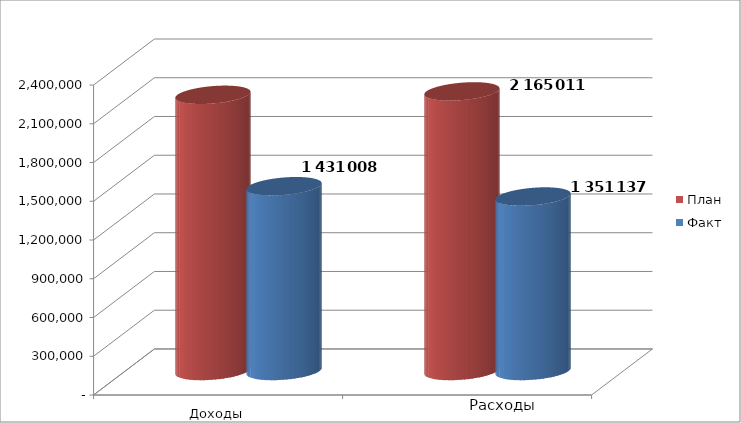
| Category | План | Факт |
|---|---|---|
| 0 | 2138606 | 1431008 |
| 1 | 2165011 | 1351137 |